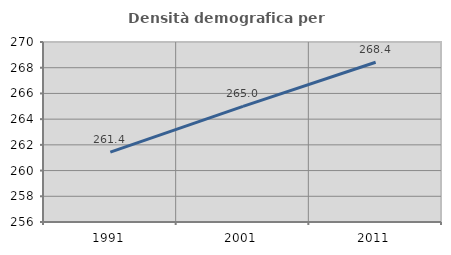
| Category | Densità demografica |
|---|---|
| 1991.0 | 261.429 |
| 2001.0 | 264.997 |
| 2011.0 | 268.427 |